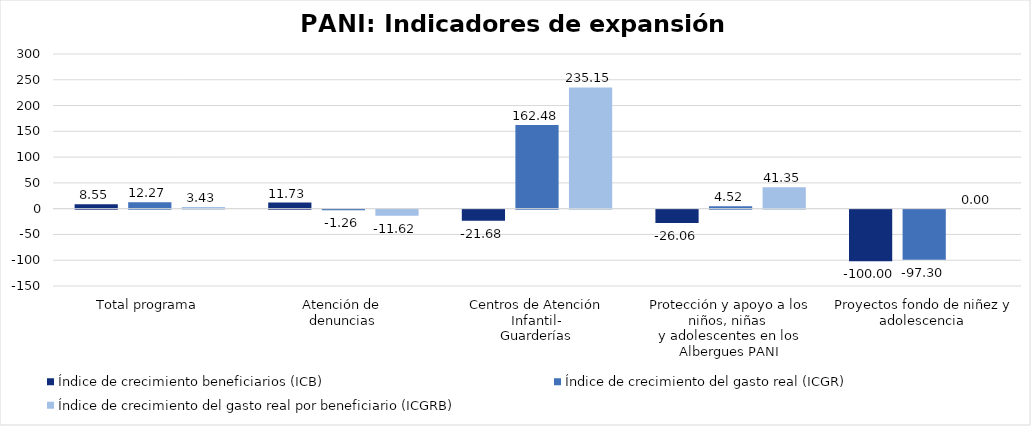
| Category | Índice de crecimiento beneficiarios (ICB)  | Índice de crecimiento del gasto real (ICGR)  | Índice de crecimiento del gasto real por beneficiario (ICGRB)  |
|---|---|---|---|
| Total programa | 8.548 | 12.27 | 3.429 |
| Atención de 
denuncias | 11.726 | -1.261 | -11.624 |
| Centros de Atención Infantil-
Guarderías | -21.684 | 162.478 | 235.154 |
| Protección y apoyo a los niños, niñas 
y adolescentes en los Albergues PANI | -26.056 | 4.523 | 41.354 |
| Proyectos fondo de niñez y adolescencia  | -100 | -97.305 | 0 |